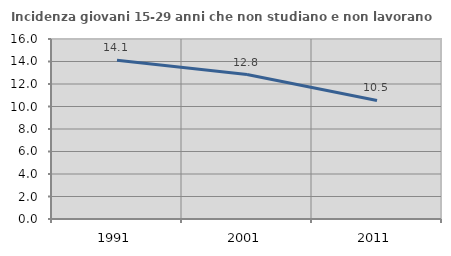
| Category | Incidenza giovani 15-29 anni che non studiano e non lavorano  |
|---|---|
| 1991.0 | 14.103 |
| 2001.0 | 12.84 |
| 2011.0 | 10.536 |